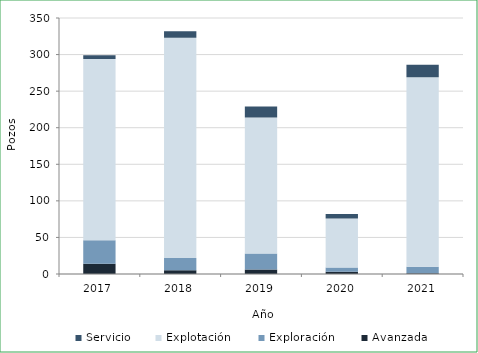
| Category | Avanzada  | Exploración  | Explotación  | Servicio |
|---|---|---|---|---|
| 2017.0 | 14 | 32 | 248 | 5 |
| 2018.0 | 5 | 17 | 301 | 9 |
| 2019.0 | 6 | 22 | 186 | 15 |
| 2020.0 | 3 | 6 | 67 | 6 |
| 2021.0 | 1 | 9 | 259 | 17 |